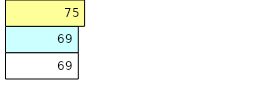
| Category | Total Standouts | Total Recd | Total Tipsters |
|---|---|---|---|
| 0 | 69 | 69 | 75 |